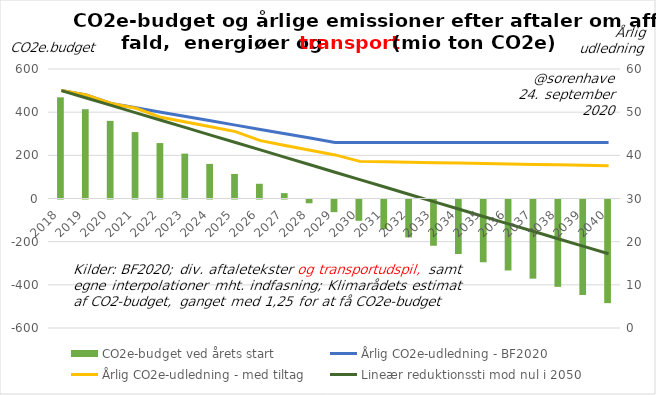
| Category | CO2e-budget ved årets start |
|---|---|
| 2018.0 | 468.75 |
| 2019.0 | 413.75 |
| 2020.0 | 359.75 |
| 2021.0 | 307.75 |
| 2022.0 | 256.85 |
| 2023.0 | 208.05 |
| 2024.0 | 160.35 |
| 2025.0 | 113.75 |
| 2026.0 | 68.25 |
| 2027.0 | 24.85 |
| 2028.0 | -17.45 |
| 2029.0 | -58.65 |
| 2030.0 | -98.75 |
| 2031.0 | -137.35 |
| 2032.0 | -175.85 |
| 2033.0 | -214.25 |
| 2034.0 | -252.55 |
| 2035.0 | -290.75 |
| 2036.0 | -328.85 |
| 2037.0 | -366.85 |
| 2038.0 | -404.75 |
| 2039.0 | -442.55 |
| 2040.0 | -480.25 |